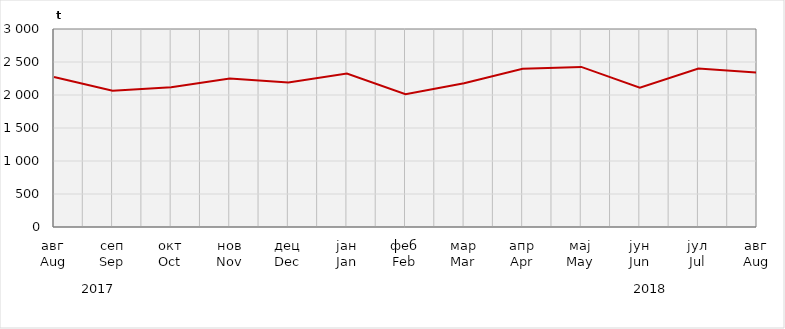
| Category | Нето тежина заклане стоке                              Net weight of  slaughtered livestock |
|---|---|
| авг
Aug | 2273238.2 |
| сеп
Sep | 2066000 |
| окт
Oct | 2118775.52 |
| нов
Nov | 2248639.95 |
| дец
Dec | 2190874.83 |
| јан
Jan | 2324971.47 |
| феб
Feb | 2010400 |
| мар
Mar | 2177800 |
| апр
Apr | 2398200 |
| мај
May | 2425732.22 |
| јун
Jun | 2110195.14 |
| јул
Jul | 2402333.82 |
| авг
Aug | 2338329.68 |